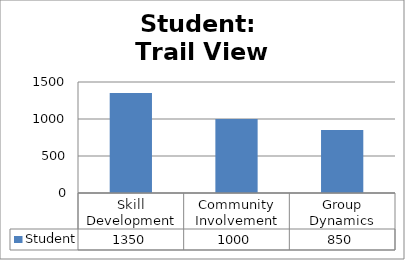
| Category | Student |
|---|---|
| Skill Development | 1350 |
| Community Involvement | 1000 |
| Group Dynamics | 850 |